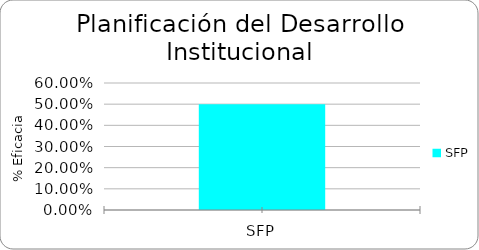
| Category | % Eficacia total |
|---|---|
| SFP | 0.5 |